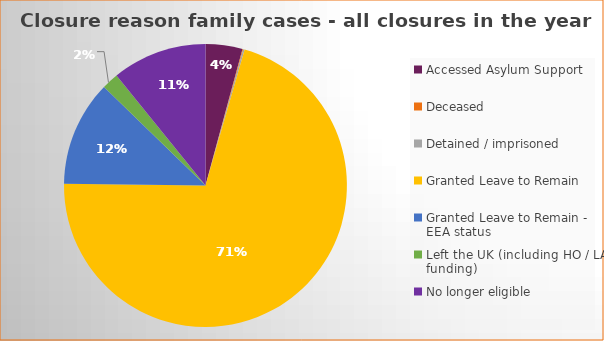
| Category | Total | Percentage |
|---|---|---|
| Accessed Asylum Support | 51 | 0.042 |
| Deceased | 1 | 0.001 |
| Detained / imprisoned | 2 | 0.002 |
| Granted Leave to Remain | 856 | 0.707 |
| Granted Leave to Remain - EEA status | 146 | 0.121 |
| Left the UK (including HO / LA funding)  | 23 | 0.019 |
| No longer eligible | 131 | 0.108 |